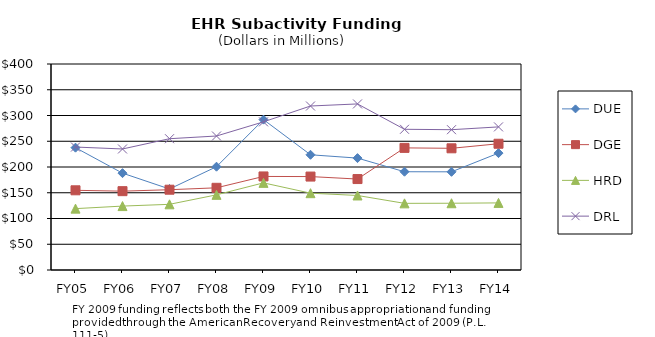
| Category | DUE | DGE | HRD | DRL |
|---|---|---|---|---|
| FY05 | 237.52 | 154.75 | 119.16 | 238.76 |
| FY06 | 188.06 | 153.07 | 124.12 | 235.01 |
| FY07 | 157.28 | 155.9 | 127.53 | 254.94 |
| FY08 | 200.56 | 159.59 | 145.94 | 260.17 |
| FY09 | 291.99 | 181.67 | 169.18 | 287.67 |
| FY10 | 223.75 | 181.43 | 149.16 | 318.42 |
| FY11 | 217.28 | 176.58 | 144.71 | 322.47 |
| FY12 | 190.79 | 237.11 | 129.41 | 273.23 |
| FY13 | 190.65 | 236.29 | 129.63 | 272.43 |
| FY14 | 226.97 | 245.15 | 130.3 | 277.87 |